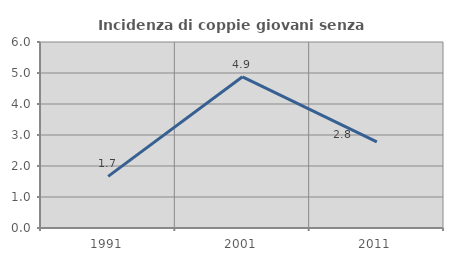
| Category | Incidenza di coppie giovani senza figli |
|---|---|
| 1991.0 | 1.667 |
| 2001.0 | 4.878 |
| 2011.0 | 2.778 |